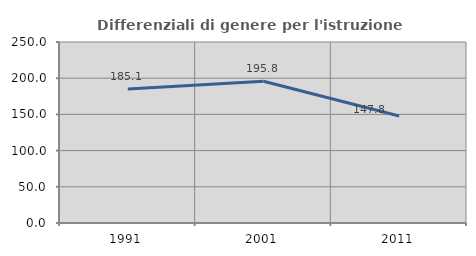
| Category | Differenziali di genere per l'istruzione superiore |
|---|---|
| 1991.0 | 185.104 |
| 2001.0 | 195.796 |
| 2011.0 | 147.783 |